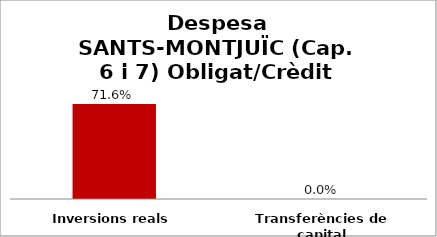
| Category | Series 0 |
|---|---|
| Inversions reals | 0.716 |
| Transferències de capital | 0 |